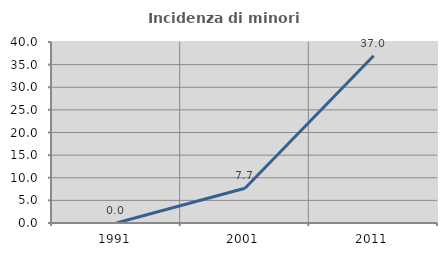
| Category | Incidenza di minori stranieri |
|---|---|
| 1991.0 | 0 |
| 2001.0 | 7.692 |
| 2011.0 | 36.957 |